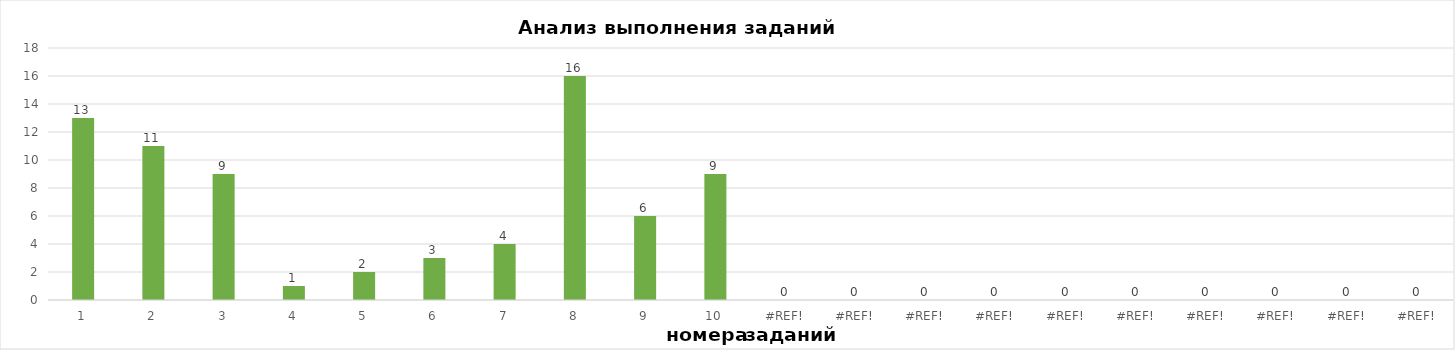
| Category | задания |
|---|---|
| 1.0 | 13 |
| 2.0 | 11 |
| 3.0 | 9 |
| 4.0 | 1 |
| 5.0 | 2 |
| 6.0 | 3 |
| 7.0 | 4 |
| 8.0 | 16 |
| 9.0 | 6 |
| 10.0 | 9 |
| 0.0 | 0 |
| 0.0 | 0 |
| 0.0 | 0 |
| 0.0 | 0 |
| 0.0 | 0 |
| 0.0 | 0 |
| 0.0 | 0 |
| 0.0 | 0 |
| 0.0 | 0 |
| 0.0 | 0 |